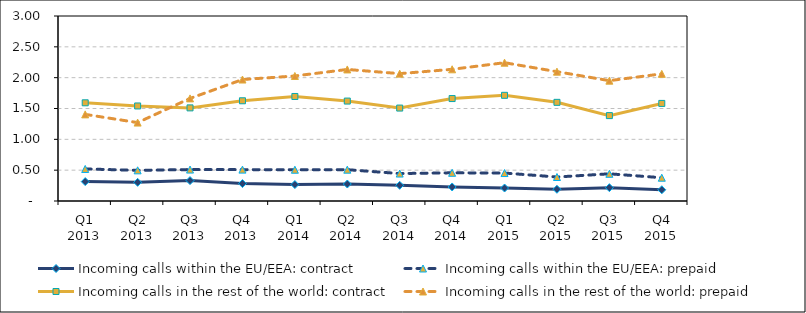
| Category | Incoming calls within the EU/EEA: contract | Incoming calls within the EU/EEA: prepaid | Incoming calls in the rest of the world: contract | Incoming calls in the rest of the world: prepaid |
|---|---|---|---|---|
| Q1 2013 | 0.315 | 0.52 | 1.592 | 1.404 |
| Q2 2013 | 0.302 | 0.497 | 1.541 | 1.272 |
| Q3 2013 | 0.331 | 0.51 | 1.51 | 1.664 |
| Q4 2013 | 0.283 | 0.509 | 1.625 | 1.97 |
| Q1 2014 | 0.266 | 0.507 | 1.695 | 2.027 |
| Q2 2014 | 0.275 | 0.508 | 1.621 | 2.133 |
| Q3 2014 | 0.254 | 0.445 | 1.507 | 2.066 |
| Q4 2014 | 0.228 | 0.457 | 1.661 | 2.136 |
| Q1 2015 | 0.211 | 0.453 | 1.714 | 2.243 |
| Q2 2015 | 0.19 | 0.389 | 1.6 | 2.097 |
| Q3 2015 | 0.217 | 0.441 | 1.385 | 1.951 |
| Q4 2015 | 0.182 | 0.378 | 1.582 | 2.062 |